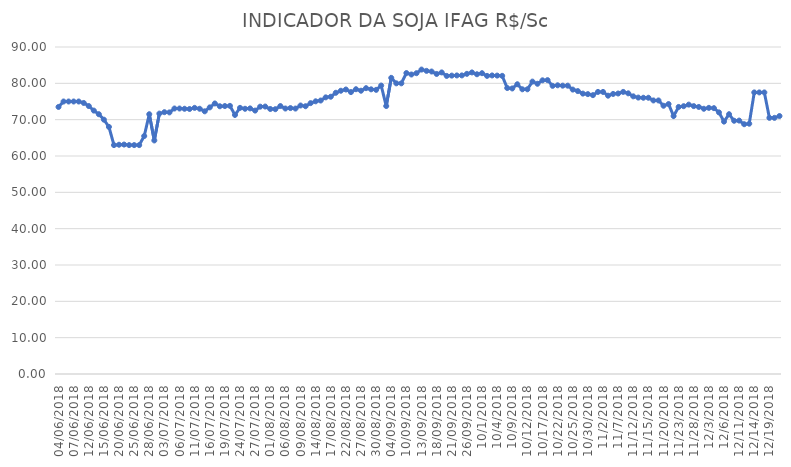
| Category | INDICADOR DA SOJA IFAG |
|---|---|
| 04/06/2018 | 73.5 |
| 05/06/2018 | 75 |
| 06/06/2018 | 75 |
| 07/06/2018 | 75 |
| 08/06/2018 | 75 |
| 11/06/2018 | 74.6 |
| 12/06/2018 | 73.75 |
| 13/06/2018 | 72.5 |
| 14/06/2018 | 71.5 |
| 15/06/2018 | 70 |
| 18/06/2018 | 68 |
| 19/06/2018 | 63 |
| 20/06/2018 | 63.1 |
| 21/06/2018 | 63.15 |
| 22/06/2018 | 63 |
| 25/06/2018 | 63 |
| 26/06/2018 | 63 |
| 27/06/2018 | 65.5 |
| 28/06/2018 | 71.5 |
| 29/06/2018 | 64.28 |
| 02/07/2018 | 71.67 |
| 03/07/2018 | 72.06 |
| 04/07/2018 | 72 |
| 05/07/2018 | 73.07 |
| 06/07/2018 | 73.07 |
| 09/07/2018 | 73 |
| 10/07/2018 | 72.94 |
| 11/07/2018 | 73.25 |
| 12/07/2018 | 73 |
| 13/07/2018 | 72.3 |
| 16/07/2018 | 73.38 |
| 17/07/2018 | 74.46 |
| 18/07/2018 | 73.69 |
| 19/07/2018 | 73.75 |
| 20/07/2018 | 73.8 |
| 23/07/2018 | 71.3 |
| 24/07/2018 | 73.25 |
| 25/07/2018 | 73 |
| 26/07/2018 | 73.1 |
| 27/07/2018 | 72.5 |
| 30/07/2018 | 73.58 |
| 31/07/2018 | 73.61 |
| 01/08/2018 | 72.94 |
| 02/08/2018 | 72.88 |
| 03/08/2018 | 73.75 |
| 06/08/2018 | 73.07 |
| 07/08/2018 | 73.19 |
| 08/08/2018 | 73.06 |
| 09/08/2018 | 73.9 |
| 10/08/2018 | 73.7 |
| 13/08/2018 | 74.55 |
| 14/08/2018 | 75.05 |
| 15/08/2018 | 75.27 |
| 16/08/2018 | 76.14 |
| 17/08/2018 | 76.31 |
| 20/08/2018 | 77.4 |
| 21/08/2018 | 77.96 |
| 22/08/2018 | 78.3 |
| 23/08/2018 | 77.59 |
| 24/08/2018 | 78.38 |
| 27/08/2018 | 77.97 |
| 28/08/2018 | 78.67 |
| 29/08/2018 | 78.35 |
| 30/08/2018 | 78.21 |
| 31/08/2018 | 79.39 |
| 03/09/2018 | 73.75 |
| 04/09/2018 | 81.5 |
| 05/09/2018 | 80 |
| 06/09/2018 | 80 |
| 10/09/2018 | 82.83 |
| 11/09/2018 | 82.43 |
| 12/09/2018 | 82.79 |
| 13/09/2018 | 83.79 |
| 14/09/2018 | 83.43 |
| 17/09/2018 | 83.25 |
| 18/09/2018 | 82.58 |
| 19/09/2018 | 83 |
| 20/09/2018 | 82.04 |
| 21/09/2018 | 82.13 |
| 24/09/2018 | 82.17 |
| 25/09/2018 | 82.18 |
| 26/09/2018 | 82.61 |
| 27/09/2018 | 83 |
| 28/09/2018 | 82.5 |
| 01/10/2018 | 82.79 |
| 02/10/2018 | 82.05 |
| 03/10/2018 | 82.17 |
| 04/10/2018 | 82.13 |
| 05/10/2018 | 82.06 |
| 08/10/2018 | 78.71 |
| 09/10/2018 | 78.59 |
| 10/10/2018 | 79.75 |
| 11/10/2018 | 78.36 |
| 12/10/2018 | 78.36 |
| 15/10/2018 | 80.473 |
| 16/10/2018 | 79.88 |
| 17/10/2018 | 80.83 |
| 18/10/2018 | 80.88 |
| 19/10/2018 | 79.31 |
| 22/10/2018 | 79.46 |
| 23/10/2018 | 79.36 |
| 24/10/2018 | 79.36 |
| 25/10/2018 | 78.28 |
| 26/10/2018 | 77.87 |
| 29/10/2018 | 77.17 |
| 30/10/2018 | 77.03 |
| 31/10/2018 | 76.75 |
| 01/11/2018 | 77.64 |
| 02/11/2018 | 77.64 |
| 05/11/2018 | 76.6 |
| 06/11/2018 | 77.08 |
| 07/11/2018 | 77.2 |
| 08/11/2018 | 77.64 |
| 09/11/2018 | 77.25 |
| 12/11/2018 | 76.42 |
| 13/11/2018 | 76.08 |
| 14/11/2018 | 76.03 |
| 15/11/2018 | 76.03 |
| 16/11/2018 | 75.29 |
| 19/11/2018 | 75.29 |
| 20/11/2018 | 73.83 |
| 21/11/2018 | 74.3 |
| 22/11/2018 | 71 |
| 23/11/2018 | 73.5 |
| 26/11/2018 | 73.71 |
| 27/11/2018 | 74.14 |
| 28/11/2018 | 73.73 |
| 29/11/2018 | 73.5 |
| 30/11/2018 | 73 |
| 03/12/2018 | 73.25 |
| 04/12/2018 | 73.17 |
| 05/12/2018 | 72 |
| 06/12/2018 | 69.47 |
| 07/12/2018 | 71.5 |
| 10/12/2018 | 69.7 |
| 11/12/2018 | 69.75 |
| 12/12/2018 | 68.75 |
| 13/12/2018 | 68.89 |
| 14/12/2018 | 77.5 |
| 17/12/2018 | 77.5 |
| 18/12/2018 | 77.5 |
| 19/12/2018 | 70.5 |
| 20/12/2018 | 70.5 |
| 21/12/2018 | 71 |